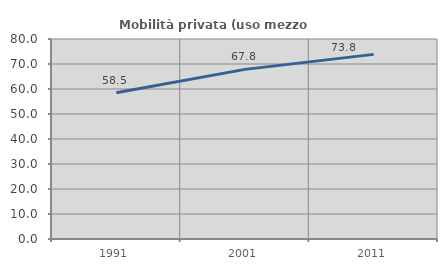
| Category | Mobilità privata (uso mezzo privato) |
|---|---|
| 1991.0 | 58.52 |
| 2001.0 | 67.848 |
| 2011.0 | 73.846 |